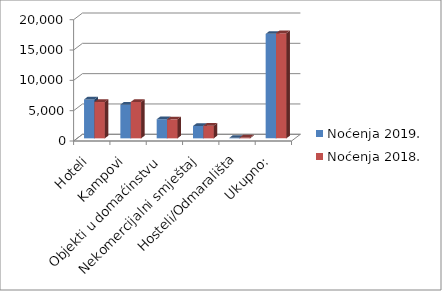
| Category | Noćenja 2019. | Noćenja 2018. |
|---|---|---|
| Hoteli | 6413 | 5988 |
| Kampovi | 5555 | 6000 |
| Objekti u domaćinstvu | 3145 | 3130 |
| Nekomercijalni smještaj | 2032 | 2076 |
| Hosteli/Odmarališta | 82 | 150 |
| Ukupno: | 17227 | 17344 |